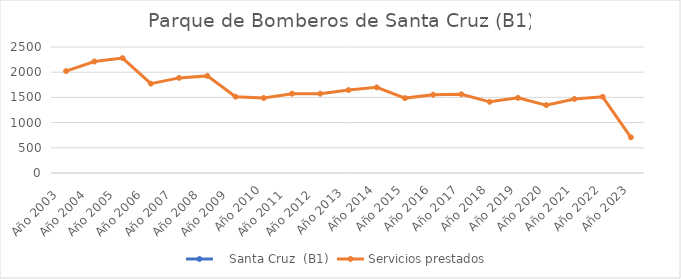
| Category |    Santa Cruz  (B1) | Servicios prestados  |
|---|---|---|
| Año 2003   |  | 2021 |
| Año 2004   |  | 2212 |
| Año 2005   |  | 2280 |
| Año 2006   |  | 1773 |
| Año 2007   |  | 1887 |
| Año 2008   |  | 1927 |
| Año 2009   |  | 1514 |
| Año 2010 |  | 1487 |
| Año 2011   |  | 1574 |
| Año 2012   |  | 1574 |
| Año 2013  |  | 1645 |
| Año 2014 |  | 1699 |
| Año 2015 |  | 1486 |
| Año 2016 |  | 1553 |
| Año 2017 |  | 1561 |
| Año 2018 |  | 1412 |
| Año 2019 |  | 1491 |
| Año 2020 |  | 1347 |
| Año 2021 |  | 1469 |
| Año 2022 |  | 1512 |
| Año 2023 |  | 708 |